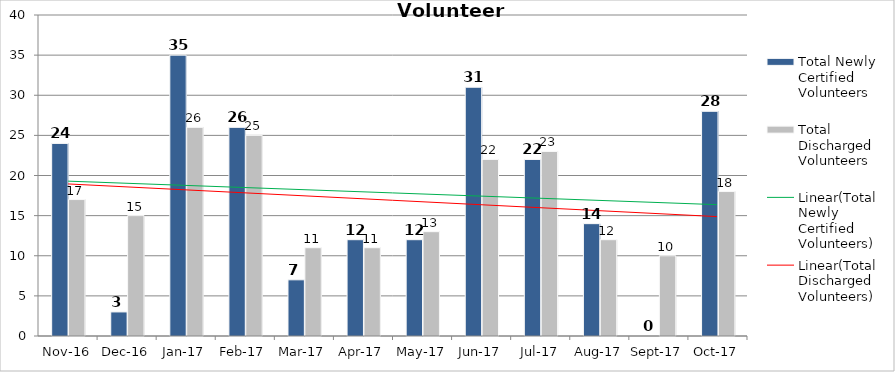
| Category | Total Newly Certified Volunteers | Total Discharged Volunteers |
|---|---|---|
| 2016-11-01 | 24 | 17 |
| 2016-12-01 | 3 | 15 |
| 2017-01-01 | 35 | 26 |
| 2017-02-01 | 26 | 25 |
| 2017-03-01 | 7 | 11 |
| 2017-04-01 | 12 | 11 |
| 2017-05-01 | 12 | 13 |
| 2017-06-01 | 31 | 22 |
| 2017-07-01 | 22 | 23 |
| 2017-08-01 | 14 | 12 |
| 2017-09-01 | 0 | 10 |
| 2017-10-01 | 28 | 18 |